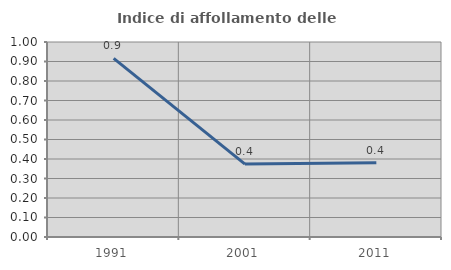
| Category | Indice di affollamento delle abitazioni  |
|---|---|
| 1991.0 | 0.916 |
| 2001.0 | 0.374 |
| 2011.0 | 0.381 |